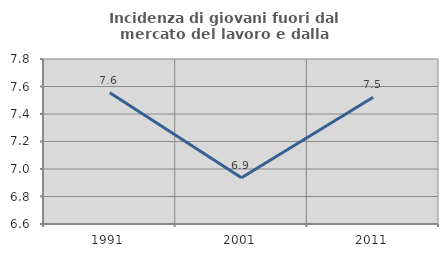
| Category | Incidenza di giovani fuori dal mercato del lavoro e dalla formazione  |
|---|---|
| 1991.0 | 7.554 |
| 2001.0 | 6.936 |
| 2011.0 | 7.522 |